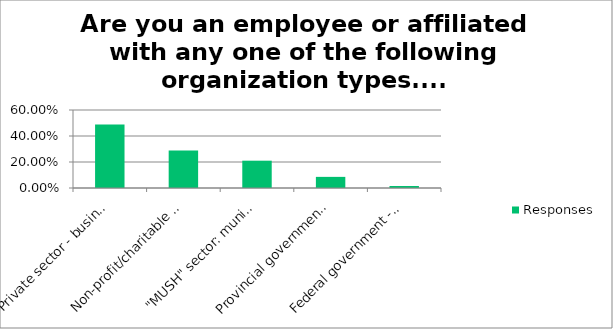
| Category | Responses |
|---|---|
| Private sector - business or business association, including ag/farm sector | 0.488 |
| Non-profit/charitable sector | 0.288 |
| "MUSH" sector: municipal, university, school, hospital | 0.21 |
| Provincial government - ministry or agency | 0.086 |
| Federal government - department or agency | 0.016 |